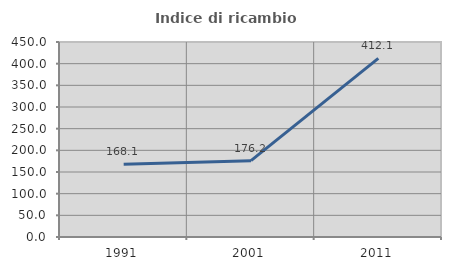
| Category | Indice di ricambio occupazionale  |
|---|---|
| 1991.0 | 168.067 |
| 2001.0 | 176.19 |
| 2011.0 | 412.069 |